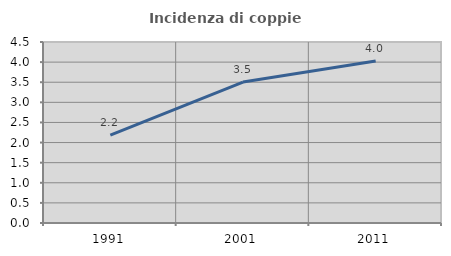
| Category | Incidenza di coppie miste |
|---|---|
| 1991.0 | 2.183 |
| 2001.0 | 3.505 |
| 2011.0 | 4.03 |